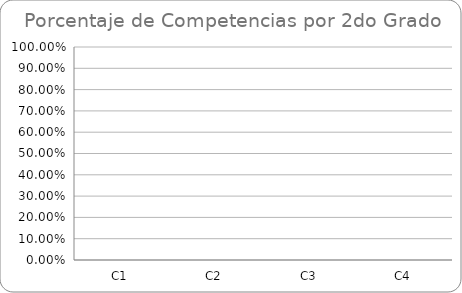
| Category | Series 0 | Series 1 | Series 2 | Series 3 |
|---|---|---|---|---|
| C1 |  |  |  | 0 |
| C2 |  |  |  | 0 |
| C3 |  |  |  | 0 |
| C4 |  |  |  | 0 |